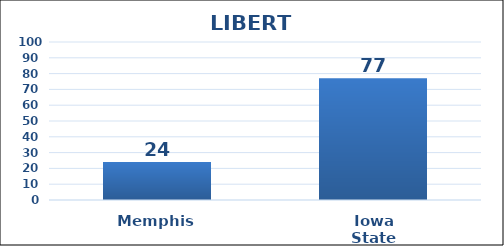
| Category | Series 0 |
|---|---|
| Memphis | 24 |
| Iowa State | 77 |